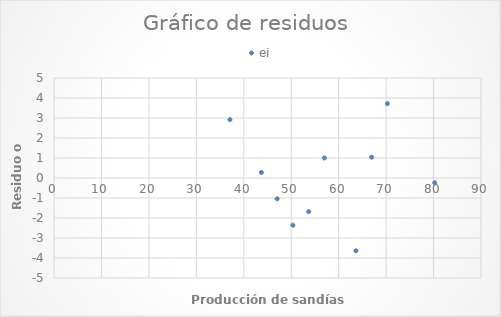
| Category | ei |
|---|---|
| 37.083333333333336 | 2.917 |
| 43.72222222222222 | 0.278 |
| 47.04166666666667 | -1.042 |
| 50.361111111111114 | -2.361 |
| 53.68055555555556 | -1.681 |
| 57.0 | 1 |
| 63.63888888888889 | -3.639 |
| 66.95833333333334 | 1.042 |
| 70.27777777777777 | 3.722 |
| 80.23611111111111 | -0.236 |